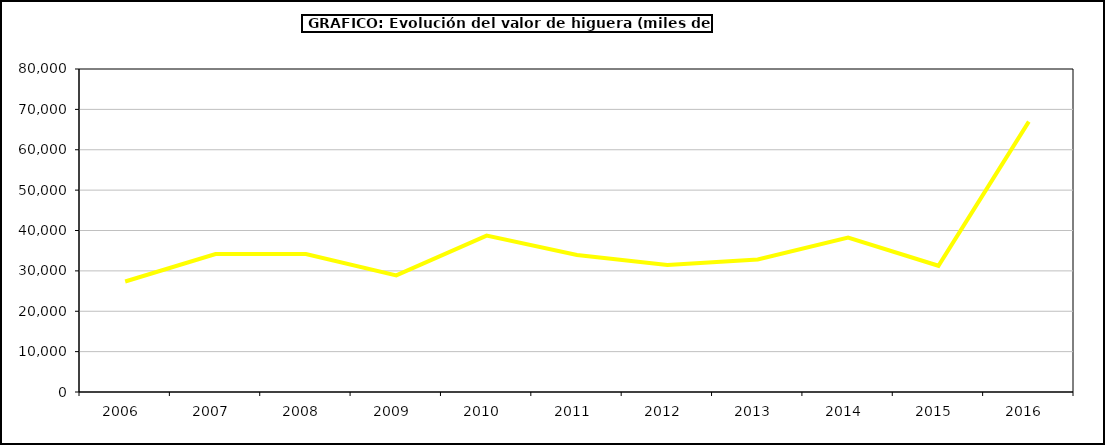
| Category | valor higuera |
|---|---|
| 2006.0 | 27367.47 |
| 2007.0 | 34159.652 |
| 2008.0 | 34191.335 |
| 2009.0 | 28875.392 |
| 2010.0 | 38741.248 |
| 2011.0 | 33937.485 |
| 2012.0 | 31478.992 |
| 2013.0 | 32844.373 |
| 2014.0 | 38257.221 |
| 2015.0 | 31266 |
| 2016.0 | 66968 |